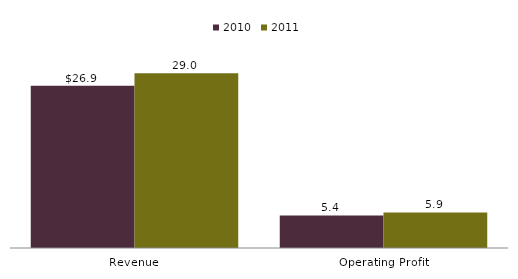
| Category | 2010 | 2011 |
|---|---|---|
| Revenue | 26.9 | 29 |
| Operating Profit | 5.4 | 5.9 |